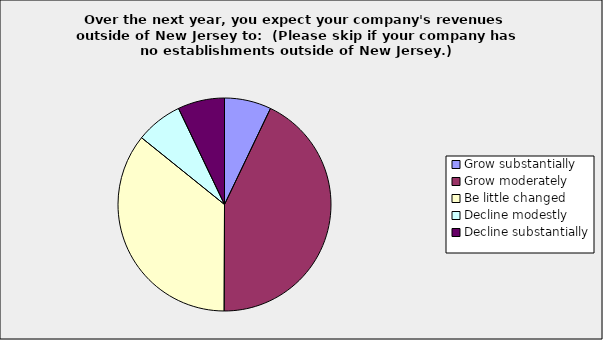
| Category | Series 0 |
|---|---|
| Grow substantially | 0.071 |
| Grow moderately | 0.429 |
| Be little changed | 0.357 |
| Decline modestly | 0.071 |
| Decline substantially | 0.071 |